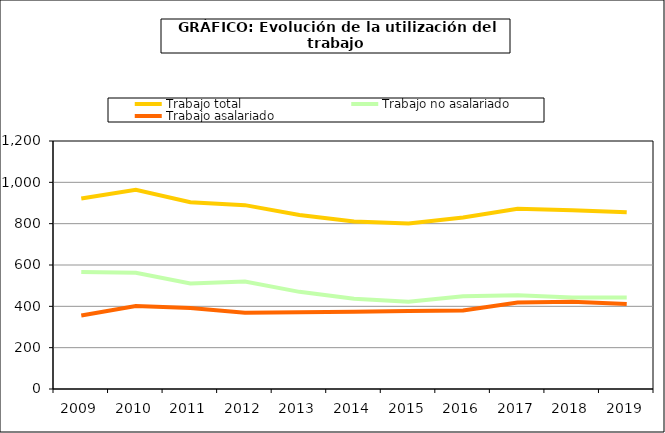
| Category | Trabajo total | Trabajo no asalariado | Trabajo asalariado |
|---|---|---|---|
| 2009.0 | 922.026 | 565.965 | 356.062 |
| 2010.0 | 963.769 | 562.528 | 401.241 |
| 2011.0 | 903.306 | 510.941 | 392.364 |
| 2012.0 | 889.651 | 520.158 | 369.493 |
| 2013.0 | 841.68 | 470.11 | 371.57 |
| 2014.0 | 810.011 | 436.377 | 373.634 |
| 2015.0 | 800.53 | 422.745 | 377.785 |
| 2016.0 | 829.51 | 449.21 | 380.3 |
| 2017.0 | 871.969 | 453.769 | 418.2 |
| 2018.0 | 865.29 | 443.02 | 422.27 |
| 2019.0 | 854.699 | 443.207 | 411.493 |